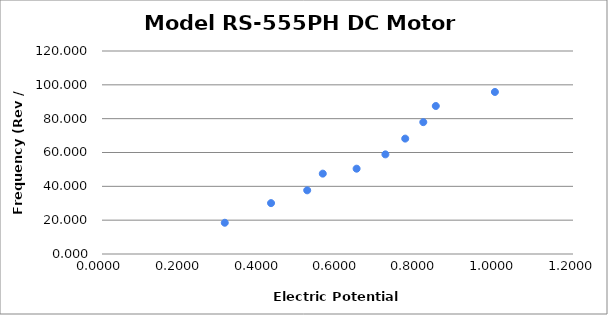
| Category | Series 0 |
|---|---|
| 0.3128 | 18.474 |
| 0.4307 | 30.066 |
| 0.5228 | 37.636 |
| 0.5625 | 47.506 |
| 0.6487 | 50.429 |
| 0.722 | 58.893 |
| 0.7725 | 68.213 |
| 0.8186 | 77.942 |
| 0.8504 | 87.489 |
| 1.001 | 95.785 |